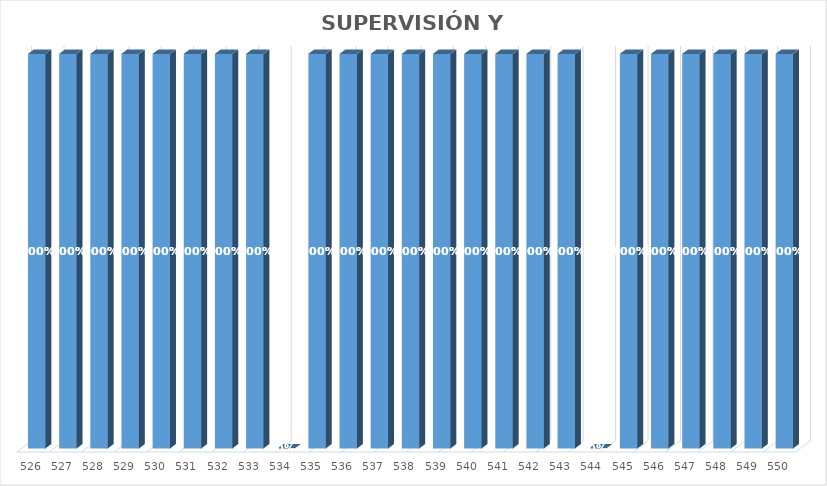
| Category | % Avance |
|---|---|
| 526.0 | 1 |
| 527.0 | 1 |
| 528.0 | 1 |
| 529.0 | 1 |
| 530.0 | 1 |
| 531.0 | 1 |
| 532.0 | 1 |
| 533.0 | 1 |
| 534.0 | 0 |
| 535.0 | 1 |
| 536.0 | 1 |
| 537.0 | 1 |
| 538.0 | 1 |
| 539.0 | 1 |
| 540.0 | 1 |
| 541.0 | 1 |
| 542.0 | 1 |
| 543.0 | 1 |
| 544.0 | 0 |
| 545.0 | 1 |
| 546.0 | 1 |
| 547.0 | 1 |
| 548.0 | 1 |
| 549.0 | 1 |
| 550.0 | 1 |